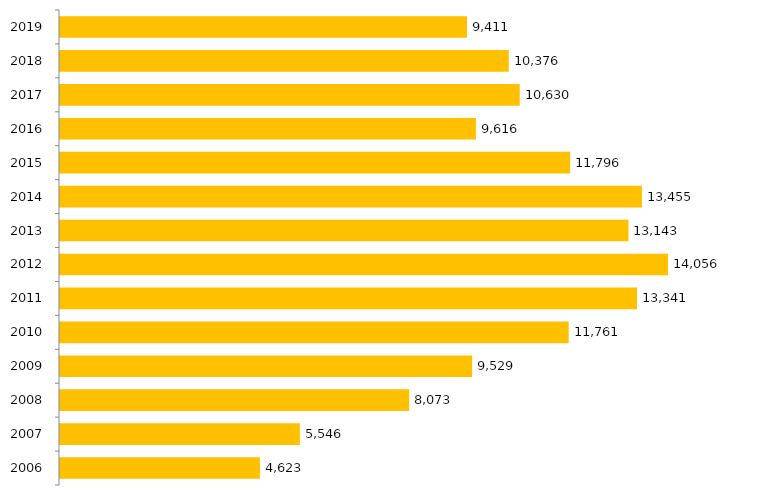
| Category | Inscritos |
|---|---|
| 2006.0 | 4623 |
| 2007.0 | 5546 |
| 2008.0 | 8073 |
| 2009.0 | 9529 |
| 2010.0 | 11761 |
| 2011.0 | 13341 |
| 2012.0 | 14056 |
| 2013.0 | 13143 |
| 2014.0 | 13455 |
| 2015.0 | 11796 |
| 2016.0 | 9616 |
| 2017.0 | 10630 |
| 2018.0 | 10376 |
| 2019.0 | 9411 |